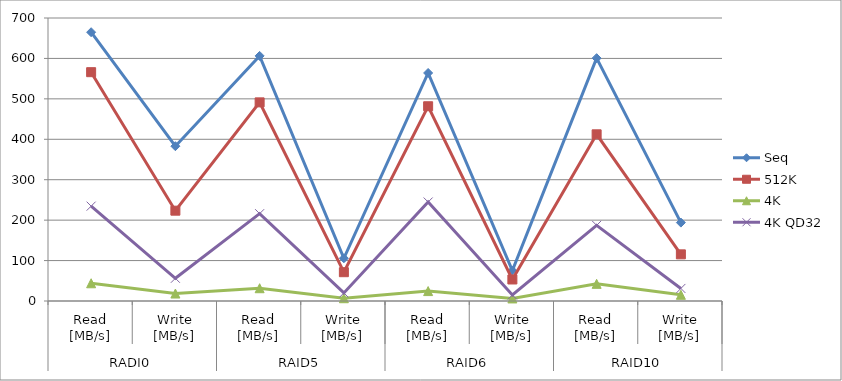
| Category | Seq | 512K | 4K | 4K QD32 |
|---|---|---|---|---|
| 0 | 664.8 | 566 | 43.86 | 234.6 |
| 1 | 382.9 | 223.4 | 18.46 | 56.23 |
| 2 | 606.3 | 491.3 | 31.6 | 216 |
| 3 | 105.7 | 71.24 | 6.86 | 20.01 |
| 4 | 564 | 481.7 | 24.53 | 244.8 |
| 5 | 75.27 | 53.25 | 6.305 | 14.98 |
| 6 | 600.7 | 412.3 | 42.41 | 187.1 |
| 7 | 193.9 | 115.4 | 15.31 | 31.04 |